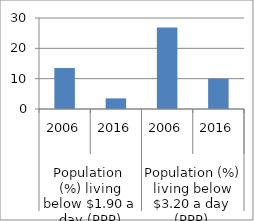
| Category | Series 0 |
|---|---|
| 0 | 13.5 |
| 1 | 3.5 |
| 2 | 26.9 |
| 3 | 10 |